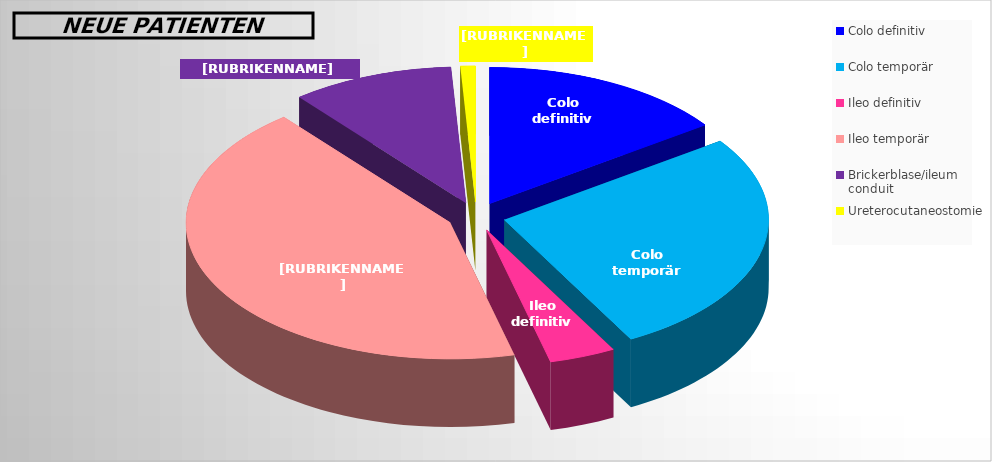
| Category | nouveaux |
|---|---|
| Colo definitiv | 0.152 |
| Colo temporär | 0.269 |
| Ileo definitiv | 0.041 |
| Ileo temporär | 0.43 |
| Brickerblase/ileum conduit | 0.099 |
| Ureterocutaneostomie | 0.009 |